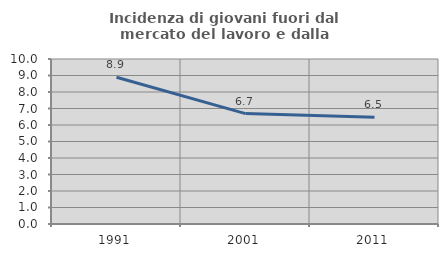
| Category | Incidenza di giovani fuori dal mercato del lavoro e dalla formazione  |
|---|---|
| 1991.0 | 8.892 |
| 2001.0 | 6.691 |
| 2011.0 | 6.465 |